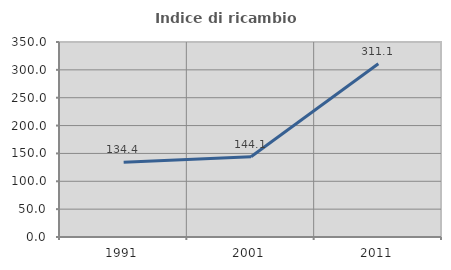
| Category | Indice di ricambio occupazionale  |
|---|---|
| 1991.0 | 134.375 |
| 2001.0 | 144.118 |
| 2011.0 | 311.111 |